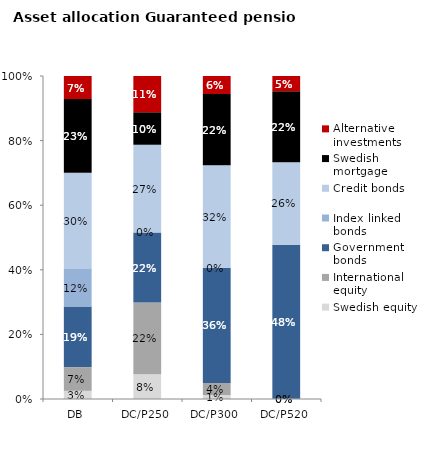
| Category | Swedish equity | International equity | Government bonds | Index linked bonds | Credit bonds | Swedish mortgage | Alternative investments |
|---|---|---|---|---|---|---|---|
| DB | 0.025 | 0.073 | 0.188 | 0.116 | 0.298 | 0.228 | 0.071 |
| DC/P250 | 0.077 | 0.222 | 0.217 | 0 | 0.271 | 0.101 | 0.112 |
| DC/P300 | 0.012 | 0.037 | 0.357 | 0 | 0.317 | 0.221 | 0.056 |
| DC/P520 | 0 | 0 | 0.477 | 0 | 0.256 | 0.219 | 0.047 |